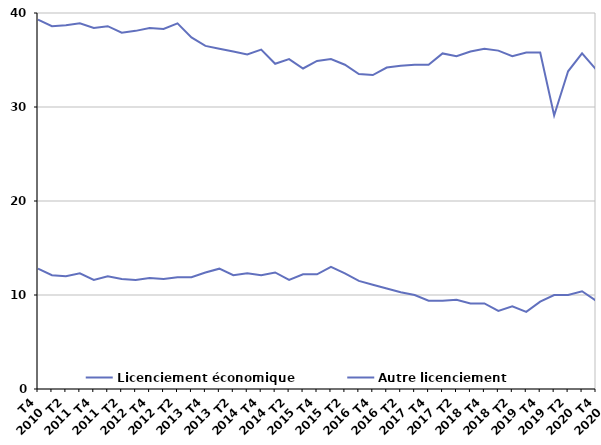
| Category | Licenciement économique | Autre licenciement |
|---|---|---|
| T4
2010 | 12.8 | 39.3 |
| T1
2011 | 12.1 | 38.6 |
| T2
2011 | 12 | 38.7 |
| T3
2011 | 12.3 | 38.9 |
| T4
2011 | 11.6 | 38.4 |
| T1
2012 | 12 | 38.6 |
| T2
2012 | 11.7 | 37.9 |
| T3
2012 | 11.6 | 38.1 |
| T4
2012 | 11.8 | 38.4 |
| T1
2013 | 11.7 | 38.3 |
| T2
2013 | 11.9 | 38.9 |
| T3
2013 | 11.9 | 37.4 |
| T4
2013 | 12.4 | 36.5 |
| T1
2014 | 12.8 | 36.2 |
| T2
2014 | 12.1 | 35.9 |
| T3
2014 | 12.3 | 35.6 |
| T4
2014 | 12.1 | 36.1 |
| T1
2015 | 12.4 | 34.6 |
| T2
2015 | 11.6 | 35.1 |
| T3
2015 | 12.2 | 34.1 |
| T4
2015 | 12.2 | 34.9 |
| T1
2016 | 13 | 35.1 |
| T2
2016 | 12.3 | 34.5 |
| T3
2016 | 11.5 | 33.5 |
| T4
2016 | 11.1 | 33.4 |
| T1
2017 | 10.7 | 34.2 |
| T2
2017 | 10.3 | 34.4 |
| T3
2017 | 10 | 34.5 |
| T4
2017 | 9.4 | 34.5 |
| T1
2018 | 9.4 | 35.7 |
| T2
2018 | 9.5 | 35.4 |
| T3
2018 | 9.1 | 35.9 |
| T4
2018 | 9.1 | 36.2 |
| T1
2019 | 8.3 | 36 |
| T2
2019 | 8.8 | 35.4 |
| T3
2019 | 8.2 | 35.8 |
| T4
2019 | 9.3 | 35.8 |
| T1
2020 | 10 | 29.1 |
| T2
2020 | 10 | 33.8 |
| T3
2020 | 10.4 | 35.7 |
| T4
2020 | 9.4 | 34 |